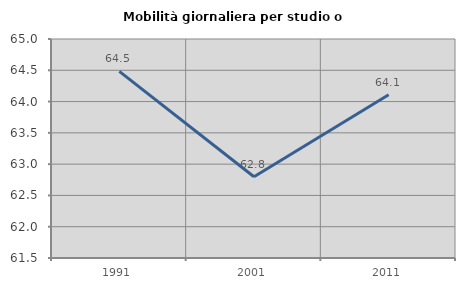
| Category | Mobilità giornaliera per studio o lavoro |
|---|---|
| 1991.0 | 64.482 |
| 2001.0 | 62.798 |
| 2011.0 | 64.109 |